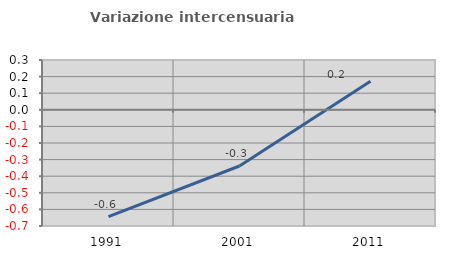
| Category | Variazione intercensuaria annua |
|---|---|
| 1991.0 | -0.643 |
| 2001.0 | -0.338 |
| 2011.0 | 0.172 |